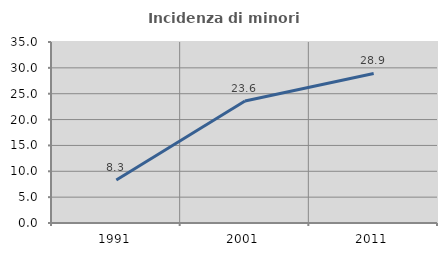
| Category | Incidenza di minori stranieri |
|---|---|
| 1991.0 | 8.333 |
| 2001.0 | 23.585 |
| 2011.0 | 28.923 |